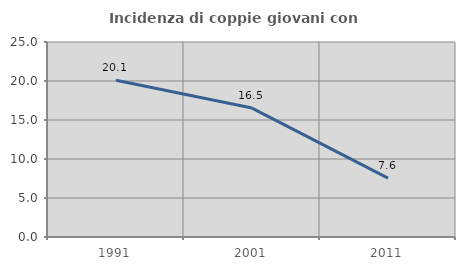
| Category | Incidenza di coppie giovani con figli |
|---|---|
| 1991.0 | 20.088 |
| 2001.0 | 16.531 |
| 2011.0 | 7.553 |